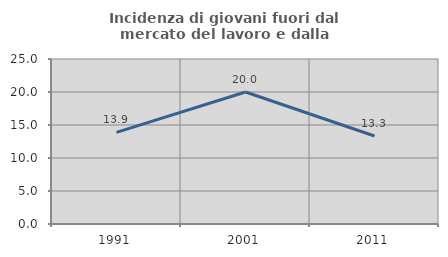
| Category | Incidenza di giovani fuori dal mercato del lavoro e dalla formazione  |
|---|---|
| 1991.0 | 13.88 |
| 2001.0 | 20 |
| 2011.0 | 13.333 |